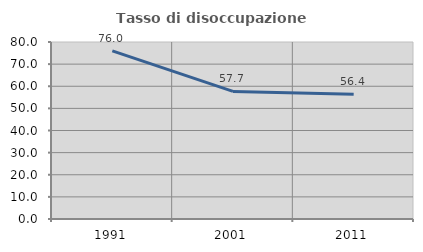
| Category | Tasso di disoccupazione giovanile  |
|---|---|
| 1991.0 | 76.017 |
| 2001.0 | 57.678 |
| 2011.0 | 56.41 |